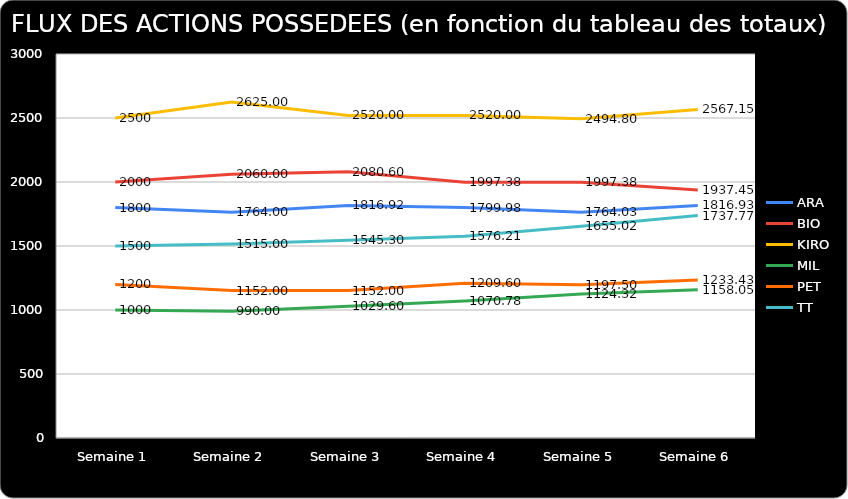
| Category | ARA | BIO | KIRO | MIL | PET | TT |
|---|---|---|---|---|---|---|
| Semaine 1 | 1800 | 2000 | 2500 | 1000 | 1200 | 1500 |
| Semaine 2 | 1764 | 2060 | 2625 | 990 | 1152 | 1515 |
| Semaine 3 | 1816.92 | 2080.6 | 2520 | 1029.6 | 1152 | 1545.3 |
| Semaine 4 | 1799.98 | 1997.376 | 2520 | 1070.784 | 1209.6 | 1576.206 |
| Semaine 5 | 1764.03 | 1997.376 | 2494.8 | 1124.323 | 1197.504 | 1655.016 |
| Semaine 6 | 1816.93 | 1937.455 | 2567.149 | 1158.053 | 1233.429 | 1737.767 |